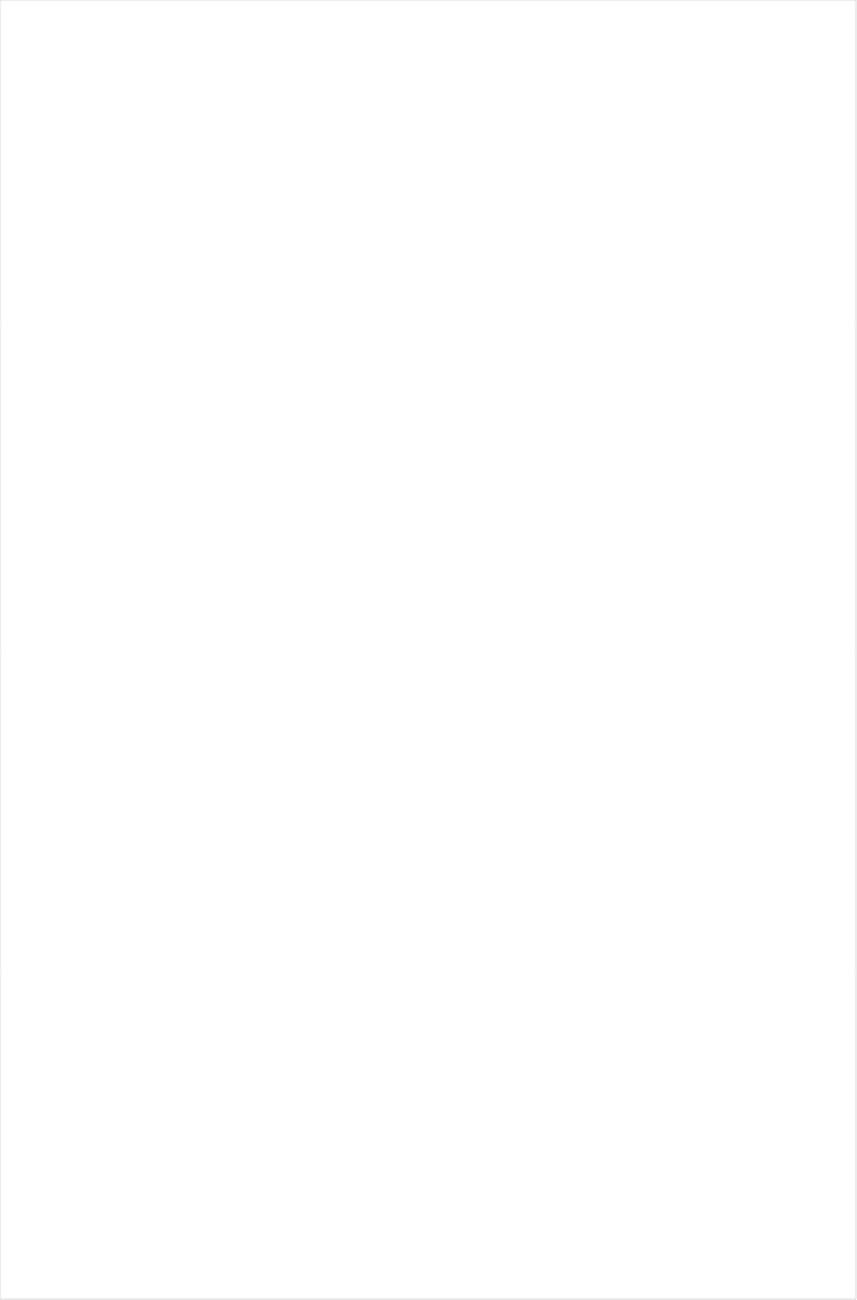
| Category | Total |
|---|---|
| Galavision | -0.982 |
| UniMas | -0.896 |
| Univision | -0.888 |
| Telemundo | -0.841 |
| NBC Universo | -0.786 |
| TUDN | -0.785 |
| TV ONE | -0.757 |
| BET | -0.755 |
| BET Her | -0.664 |
| Lifetime Movies | -0.6 |
| Cartoon Network | -0.591 |
| VH1 | -0.591 |
| MTV2 | -0.5 |
| Oprah Winfrey Network | -0.461 |
| Disney Channel | -0.349 |
| Nick Jr. | -0.33 |
| RFD TV | -0.328 |
| WE TV | -0.283 |
| INSP | -0.271 |
| Hallmark Movies & Mysteries | -0.26 |
| Hallmark | -0.24 |
| Investigation Discovery | -0.231 |
| Universal Kids | -0.228 |
| Lifetime | -0.225 |
| Disney Junior US | -0.223 |
| TLC | -0.178 |
| Nick | -0.173 |
| Nick Toons | -0.163 |
| Headline News | -0.127 |
| OXYGEN | -0.106 |
| Great American Country | -0.09 |
| Teen Nick | -0.067 |
| Disney XD | -0.062 |
| Logo | -0.055 |
| MSNBC | -0.02 |
| POP | -0.019 |
| Discovery Family Channel | -0.014 |
| Discovery Life Channel | -0.013 |
| ION | -0.006 |
| CMTV | 0.052 |
| BRAVO | 0.052 |
| Game Show | 0.056 |
| CW | 0.061 |
| Travel | 0.064 |
| FX Movie Channel | 0.071 |
| NBA TV | 0.086 |
| CNN | 0.093 |
| ABC | 0.101 |
| Adult Swim | 0.105 |
| Nick@Nite | 0.107 |
| MyNetworkTV | 0.11 |
| FOX | 0.125 |
| HGTV | 0.13 |
| SYFY | 0.134 |
| UP TV | 0.137 |
| E! | 0.141 |
| TV LAND | 0.149 |
| CBS | 0.156 |
| Fox Business | 0.162 |
| A&E | 0.172 |
| National Geographic Wild | 0.175 |
| MTV | 0.18 |
| USA Network | 0.186 |
| Reelz Channel | 0.213 |
| Freeform | 0.226 |
| Fox News | 0.23 |
| Motor Trend Network | 0.251 |
| TNT | 0.253 |
| Ovation | 0.254 |
| NBC | 0.268 |
| FXDEP | 0.278 |
| PBS | 0.279 |
| FXX | 0.292 |
| WGN America | 0.299 |
| History Channel | 0.306 |
| Discovery Channel | 0.321 |
| Paramount Network | 0.326 |
| FYI | 0.326 |
| BBC America | 0.365 |
| FX | 0.368 |
| DIY | 0.368 |
| Science Channel | 0.389 |
| ESPN Deportes | 0.395 |
| Weather Channel | 0.402 |
| SundanceTV | 0.406 |
| Cooking Channel | 0.415 |
| AMC | 0.415 |
| Animal Planet | 0.427 |
| TBS | 0.429 |
| Food Network | 0.443 |
| CNBC | 0.499 |
| American Heroes Channel | 0.503 |
| National Geographic | 0.567 |
| truTV | 0.587 |
| Destination America | 0.611 |
| Independent Film (IFC) | 0.612 |
| Outdoor Channel | 0.627 |
| The Sportsman Channel | 0.633 |
| Bloomberg HD | 0.688 |
| Smithsonian | 0.697 |
| Comedy Central | 0.703 |
| Viceland | 0.719 |
| Tennis Channel | 0.888 |
| ESPN2 | 0.907 |
| ESPN | 1.033 |
| PAC-12 Network | 1.077 |
| ESPNEWS | 1.164 |
| ESPNU | 1.431 |
| CBS Sports | 1.57 |
| NFL Network | 1.577 |
| NBC Sports | 1.614 |
| Fox Sports 1 | 1.622 |
| Big Ten Network | 1.885 |
| Golf | 1.956 |
| FOX Sports 2 | 1.978 |
| Olympic Channel | 2.373 |
| MLB Network | 2.492 |
| NHL | 17.686 |